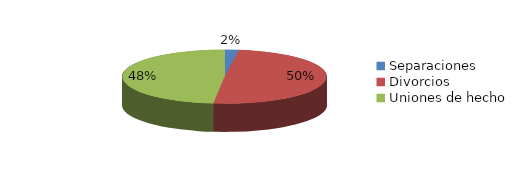
| Category | Series 0 |
|---|---|
| Separaciones | 58 |
| Divorcios | 1296 |
| Uniones de hecho | 1264 |